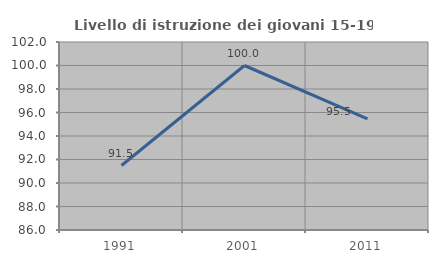
| Category | Livello di istruzione dei giovani 15-19 anni |
|---|---|
| 1991.0 | 91.489 |
| 2001.0 | 100 |
| 2011.0 | 95.455 |